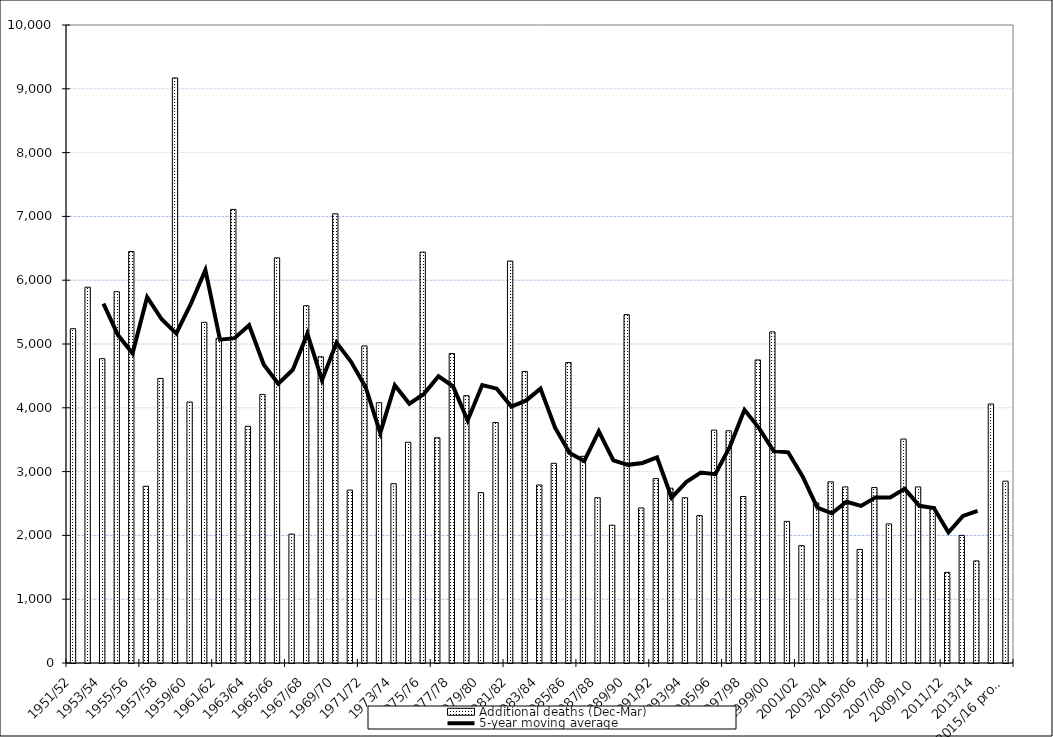
| Category | Additional deaths (Dec-Mar) |
|---|---|
| 1951/52 | 5240 |
| 1952/53 | 5890 |
| 1953/54 | 4770 |
| 1954/55 | 5820 |
| 1955/56 | 6450 |
| 1956/57 | 2770 |
| 1957/58 | 4460 |
| 1958/59 | 9170 |
| 1959/60 | 4090 |
| 1960/61 | 5340 |
| 1961/62 | 5090 |
| 1962/63 | 7110 |
| 1963/64 | 3710 |
| 1964/65 | 4210 |
| 1965/66 | 6350 |
| 1966/67 | 2020 |
| 1967/68 | 5600 |
| 1968/69 | 4800 |
| 1969/70 | 7040 |
| 1970/71 | 2710 |
| 1971/72 | 4970 |
| 1972/73 | 4080 |
| 1973/74 | 2810 |
| 1974/75 | 3460 |
| 1975/76 | 6440 |
| 1976/77 | 3530 |
| 1977/78 | 4850 |
| 1978/79 | 4190 |
| 1979/80 | 2670 |
| 1980/81 | 3770 |
| 1981/82 | 6300 |
| 1982/83 | 4570 |
| 1983/84 | 2790 |
| 1984/85 | 3130 |
| 1985/86 | 4710 |
| 1986/87 | 3240 |
| 1987/88 | 2590 |
| 1988/89 | 2160 |
| 1989/90 | 5460 |
| 1990/91 | 2430 |
| 1991/92 | 2890 |
| 1992/93 | 2740 |
| 1993/94 | 2590 |
| 1994/95 | 2310 |
| 1995/96 | 3650 |
| 1996/97 | 3640 |
| 1997/98 | 2610 |
| 1998/99 | 4750 |
| 1999/00 | 5190 |
| 2000/01 | 2220 |
| 2001/02 | 1840 |
| 2002/03 | 2510 |
| 2003/04 | 2840 |
| 2004/05 | 2760 |
| 2005/06 | 1780 |
| 2006/07 | 2750 |
| 2007/08 | 2180 |
| 2008/09 | 3510 |
| 2009/10  | 2760 |
| 2010/11 | 2450 |
| 2011/12 | 1420 |
| 2012/13 | 2000 |
| 2013/14 | 1600 |
| 2014/15 | 4060 |
| 2015/16 prov. | 2850 |